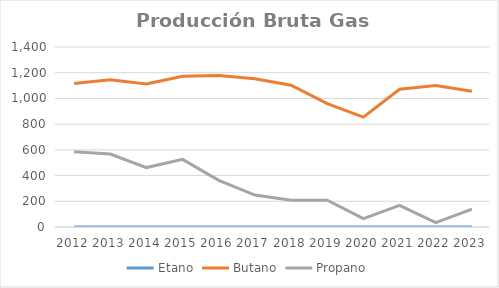
| Category | Etano | Butano | Propano |
|---|---|---|---|
| 2012.0 | 0 | 1116.239 | 584.866 |
| 2013.0 | 0 | 1144.6 | 567.887 |
| 2014.0 | 0 | 1112.583 | 462.256 |
| 2015.0 | 0 | 1173.108 | 525.892 |
| 2016.0 | 0 | 1178.07 | 362.93 |
| 2017.0 | 0 | 1152.733 | 248.267 |
| 2018.0 | 0 | 1103.134 | 207.776 |
| 2019.0 | 0 | 958.995 | 208.005 |
| 2020.0 | 0 | 854.304 | 65.696 |
| 2021.0 | 0 | 1071.233 | 168.737 |
| 2022.0 | 0 | 1100.682 | 34.631 |
| 2023.0 | 0 | 1055.728 | 138.849 |